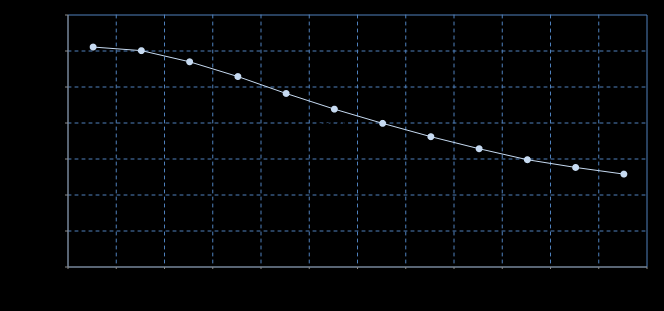
| Category | Series 0 |
|---|---|
| Nov 19 | 55.11 |
| Dec 19 | 55.01 |
| Jan 20 | 54.7 |
| Feb 20 | 54.29 |
| Mar 20 | 53.82 |
| Apr 20 | 53.385 |
| May 20 | 52.99 |
| Jun 20 | 52.62 |
| Jul 20 | 52.285 |
| Aug 20 | 51.98 |
| Sep 20 | 51.765 |
| Oct 20 | 51.58 |